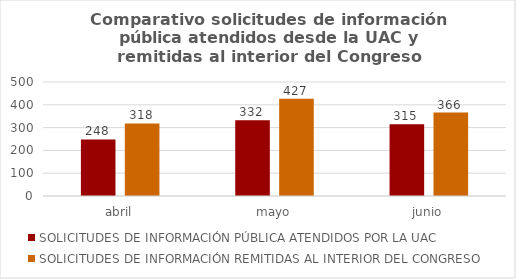
| Category | SOLICITUDES DE INFORMACIÓN PÚBLICA ATENDIDOS POR LA UAC | SOLICITUDES DE INFORMACIÓN REMITIDAS AL INTERIOR DEL CONGRESO  |
|---|---|---|
| abril | 248 | 318 |
| mayo | 332 | 427 |
| junio | 315 | 366 |